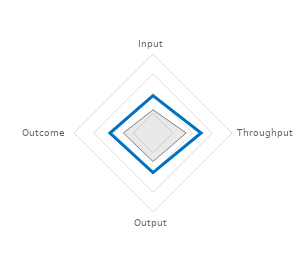
| Category | United States | OECD avg. |
|---|---|---|
| Input | 0.474 | 0.293 |
| Throughput | 0.608 | 0.421 |
| Output | 0.502 | 0.361 |
| Outcome | 0.546 | 0.375 |